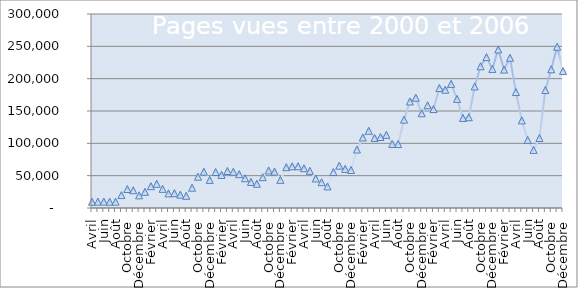
| Category | Series 0 |
|---|---|
| Avril | 9669 |
| Mai | 9886 |
| Juin | 10003 |
| Juillet | 9803 |
| Août | 9882 |
| Septembre | 20005 |
| Octobre | 29367 |
| Novembre | 27517 |
| Décembre | 19552 |
| Janvier | 25114 |
| Février | 33760 |
| Mars | 37482 |
| Avril | 29660 |
| Mai | 22613 |
| Juin | 22938.206 |
| Juillet | 20633 |
| Août | 18936 |
| Septembre | 31414 |
| Octobre | 48431 |
| Novembre | 56240 |
| Décembre | 43494 |
| Janvier | 55681 |
| Février | 51209 |
| Mars | 57313 |
| Avril | 56068 |
| Mai | 52313 |
| Juin | 45997 |
| Juillet | 40318 |
| Août | 37546 |
| Septembre | 47670 |
| Octobre | 58126 |
| Novembre | 56357 |
| Décembre | 43518 |
| Janvier | 63125 |
| Février | 64499 |
| Mars | 64575 |
| Avril | 61505 |
| Mai | 57493 |
| Juin | 45678 |
| Juillet | 39907 |
| Août | 33434 |
| Septembre | 55634 |
| Octobre | 65485 |
| Novembre | 60523 |
| Décembre | 58850 |
| Janvier | 90464 |
| Février | 109133 |
| Mars | 119479 |
| Avril | 108401 |
| Mai | 109784 |
| Juin | 113251 |
| Juillet | 99119 |
| Août | 98922 |
| Septembre | 136684 |
| Octobre | 164769 |
| Novembre | 170600 |
| Décembre | 146468 |
| Janvier | 158904 |
| Février | 152995 |
| Mars | 185598 |
| Avril | 182968 |
| Mai | 191978 |
| Juin | 168771 |
| Juillet | 139307 |
| Août | 140337 |
| Septembre | 187965 |
| Octobre | 219196 |
| Novembre | 233370 |
| Décembre | 215134 |
| Janvier | 245257 |
| Février | 214057 |
| Mars | 232372 |
| Avril | 179292 |
| Mai | 135494 |
| Juin | 105438 |
| Juillet | 89839 |
| Août | 108340 |
| Septembre | 182533 |
| Octobre | 214559 |
| Novembre | 249440 |
| Décembre | 212000 |